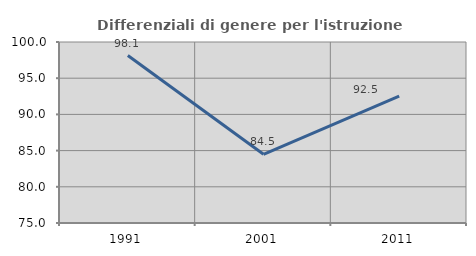
| Category | Differenziali di genere per l'istruzione superiore |
|---|---|
| 1991.0 | 98.129 |
| 2001.0 | 84.486 |
| 2011.0 | 92.511 |